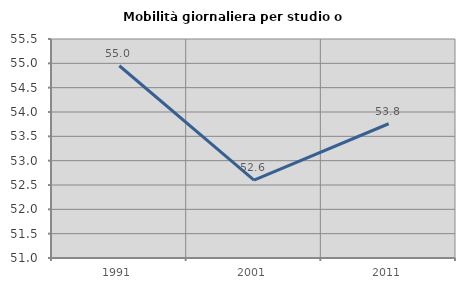
| Category | Mobilità giornaliera per studio o lavoro |
|---|---|
| 1991.0 | 54.95 |
| 2001.0 | 52.601 |
| 2011.0 | 53.759 |